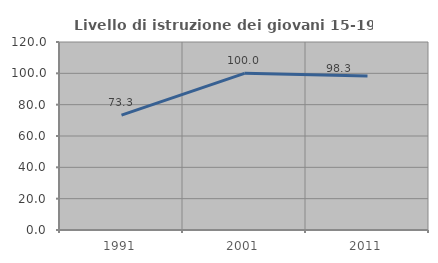
| Category | Livello di istruzione dei giovani 15-19 anni |
|---|---|
| 1991.0 | 73.279 |
| 2001.0 | 100 |
| 2011.0 | 98.305 |